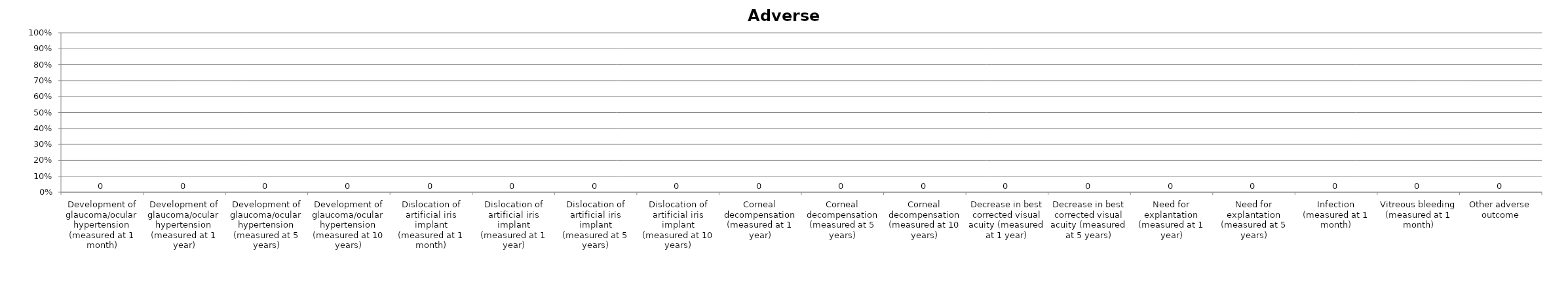
| Category | Series 0 |
|---|---|
| Development of glaucoma/ocular hypertension (measured at 1 month) | 0 |
| Development of glaucoma/ocular hypertension (measured at 1 year) | 0 |
| Development of glaucoma/ocular hypertension (measured at 5 years) | 0 |
| Development of glaucoma/ocular hypertension (measured at 10 years) | 0 |
| Dislocation of artificial iris implant (measured at 1 month) | 0 |
| Dislocation of artificial iris implant (measured at 1 year) | 0 |
| Dislocation of artificial iris implant (measured at 5 years) | 0 |
| Dislocation of artificial iris implant (measured at 10 years) | 0 |
| Corneal decompensation (measured at 1 year) | 0 |
| Corneal decompensation (measured at 5 years) | 0 |
| Corneal decompensation (measured at 10 years) | 0 |
| Decrease in best corrected visual acuity (measured at 1 year) | 0 |
| Decrease in best corrected visual acuity (measured at 5 years) | 0 |
| Need for explantation (measured at 1 year) | 0 |
| Need for explantation (measured at 5 years) | 0 |
| Infection (measured at 1 month) | 0 |
| Vitreous bleeding (measured at 1 month) | 0 |
| Other adverse outcome | 0 |